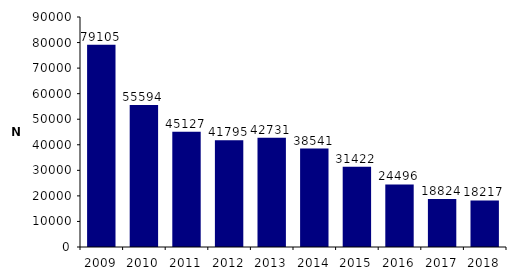
| Category | Caryotypes foetaux |
|---|---|
| 2009.0 | 79105 |
| 2010.0 | 55594 |
| 2011.0 | 45127 |
| 2012.0 | 41795 |
| 2013.0 | 42731 |
| 2014.0 | 38541 |
| 2015.0 | 31422 |
| 2016.0 | 24496 |
| 2017.0 | 18824 |
| 2018.0 | 18217 |